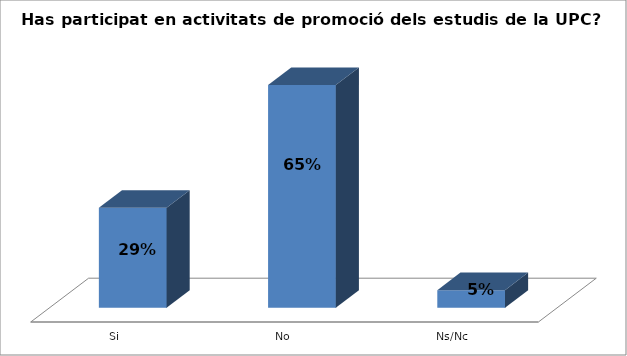
| Category | Series 0 |
|---|---|
| Si | 0.294 |
| No | 0.654 |
| Ns/Nc | 0.052 |